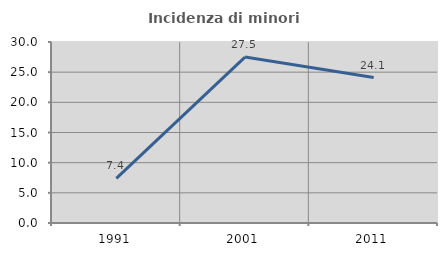
| Category | Incidenza di minori stranieri |
|---|---|
| 1991.0 | 7.407 |
| 2001.0 | 27.5 |
| 2011.0 | 24.113 |